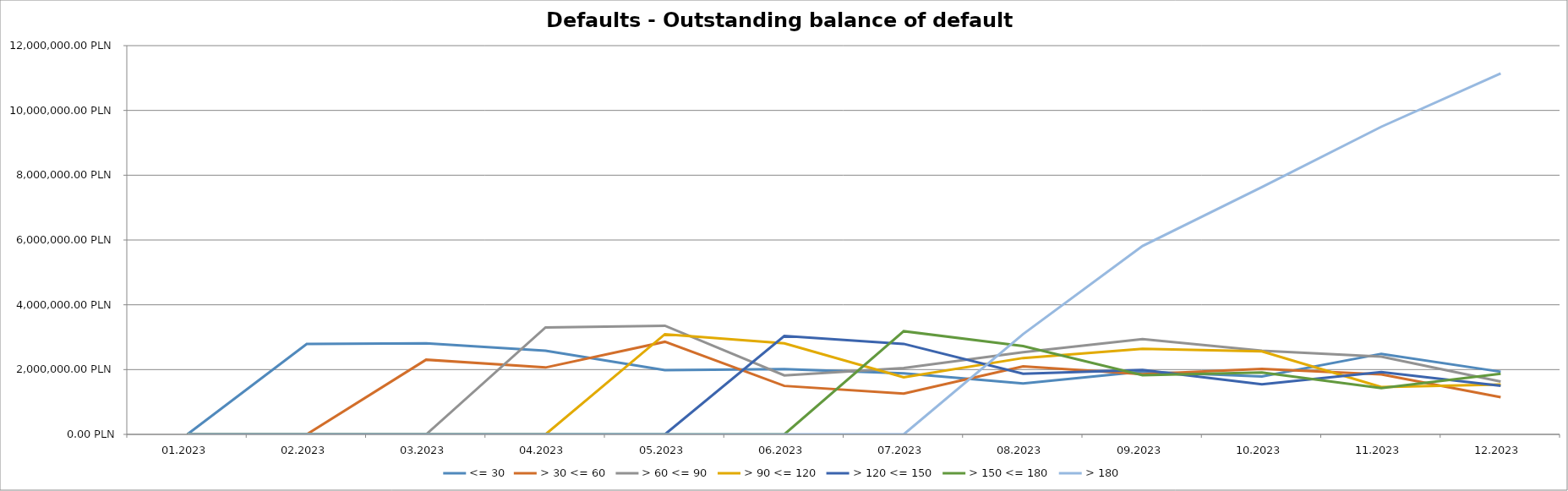
| Category | <= 30 | > 30 <= 60 | > 60 <= 90 | > 90 <= 120 | > 120 <= 150 | > 150 <= 180 | > 180 |
|---|---|---|---|---|---|---|---|
| 01.2023 | 0 | 0 | 0 | 0 | 0 | 0 | 0 |
| 02.2023 | 2788519.82 | 0 | 0 | 0 | 0 | 0 | 0 |
| 03.2023 | 2811517.14 | 2305154.07 | 0 | 0 | 0 | 0 | 0 |
| 04.2023 | 2584791.3 | 2064675.87 | 3301101.31 | 0 | 0 | 0 | 0 |
| 05.2023 | 1985441.56 | 2858398.5 | 3353485.78 | 3091988.77 | 0 | 0 | 0 |
| 06.2023 | 2016845.02 | 1496657.8 | 1822162.63 | 2812422.86 | 3037767.68 | 0 | 0 |
| 07.2023 | 1886118.05 | 1257979.4 | 2047168.21 | 1762916.26 | 2793763.11 | 3184053.47 | 0 |
| 08.2023 | 1572650.17 | 2099798.77 | 2534461.69 | 2357426.74 | 1871124.51 | 2723545.23 | 3093972.9 |
| 09.2023 | 1936023.84 | 1858916.55 | 2940706.37 | 2644290.89 | 1991761.95 | 1826544.8 | 5816448.05 |
| 10.2023 | 1787856.09 | 2019010.42 | 2585069.36 | 2560620.78 | 1548143.78 | 1909160.81 | 7632122.35 |
| 11.2023 | 2487439.47 | 1854213.59 | 2398255.83 | 1460739.8 | 1923073.63 | 1431220.99 | 9496137.88 |
| 12.2023 | 1933713.74 | 1149222.92 | 1628673.09 | 1540023.57 | 1499486.96 | 1871239.58 | 11143858.33 |